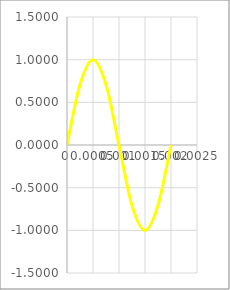
| Category | Sin(2*pi*f0*nTs) |
|---|---|
| 0.0 | 0 |
| 0.00025 | 0.707 |
| 0.0005 | 1 |
| 0.00075 | 0.707 |
| 0.001 | 0 |
| 0.00125 | -0.707 |
| 0.0015 | -1 |
| 0.00175 | -0.707 |
| 0.002 | 0 |